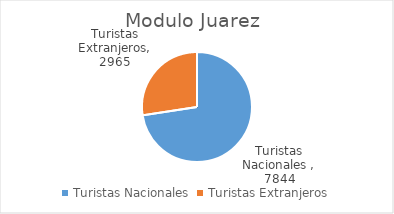
| Category | Total General  |
|---|---|
| Turistas Nacionales  | 7844 |
| Turistas Extranjeros | 2965 |